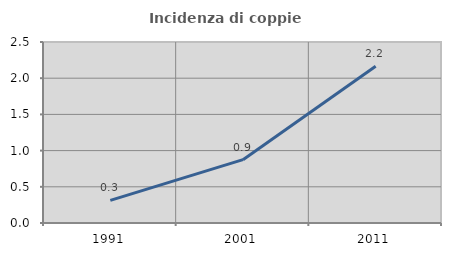
| Category | Incidenza di coppie miste |
|---|---|
| 1991.0 | 0.312 |
| 2001.0 | 0.875 |
| 2011.0 | 2.166 |